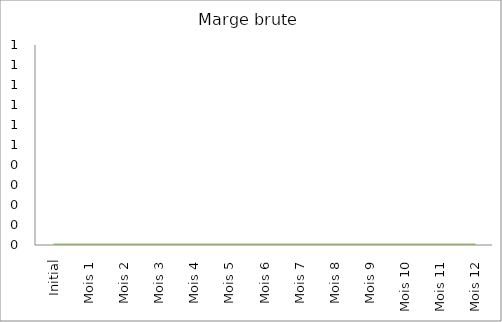
| Category | Marge brute |
|---|---|
| Initial | 0 |
| Mois 1 | 0 |
| Mois 2 | 0 |
| Mois 3 | 0 |
| Mois 4 | 0 |
| Mois 5 | 0 |
| Mois 6 | 0 |
| Mois 7 | 0 |
| Mois 8 | 0 |
| Mois 9 | 0 |
| Mois 10 | 0 |
| Mois 11 | 0 |
| Mois 12 | 0 |